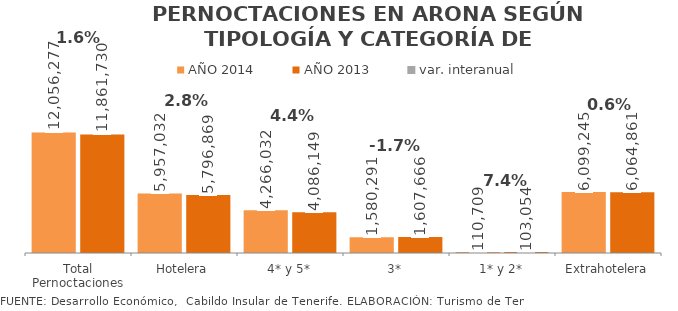
| Category | AÑO 2014 | AÑO 2013 |
|---|---|---|
| Total Pernoctaciones | 12056277 | 11861730 |
| Hotelera | 5957032 | 5796869 |
| 4* y 5* | 4266032 | 4086149 |
| 3* | 1580291 | 1607666 |
| 1* y 2* | 110709 | 103054 |
| Extrahotelera | 6099245 | 6064861 |